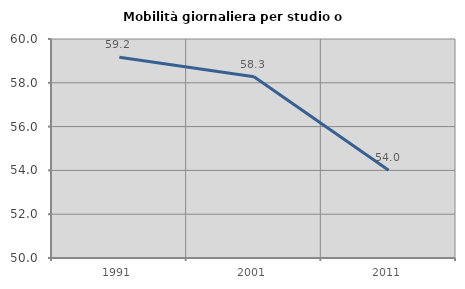
| Category | Mobilità giornaliera per studio o lavoro |
|---|---|
| 1991.0 | 59.172 |
| 2001.0 | 58.279 |
| 2011.0 | 54.006 |